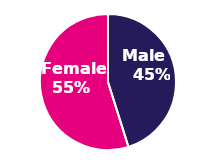
| Category | Series 0 |
|---|---|
| 0 | 130064 |
| 1 | 158069 |